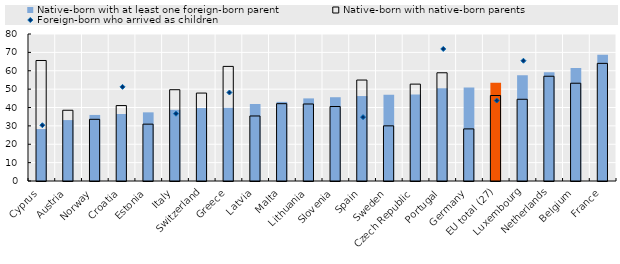
| Category | Native-born with at least one foreign-born parent | Native-born with native-born parents |
|---|---|---|
| Cyprus | 28.262 | 65.582 |
| Austria | 33.153 | 38.5 |
| Norway | 35.952 | 33.57 |
| Croatia | 36.472 | 41.052 |
| Estonia | 37.365 | 30.942 |
| Italy | 38.757 | 49.677 |
| Switzerland | 39.709 | 47.851 |
| Greece | 39.848 | 62.364 |
| Latvia | 41.891 | 35.385 |
| Malta | 43.061 | 42.083 |
| Lithuania | 44.958 | 41.912 |
| Slovenia | 45.594 | 40.538 |
| Spain | 46.229 | 54.945 |
| Sweden | 46.888 | 30.016 |
| Czech Republic | 47.069 | 52.727 |
| Portugal | 50.419 | 58.899 |
| Germany | 50.879 | 28.353 |
| EU total (27) | 53.526 | 46.52 |
| Luxembourg | 57.56 | 44.475 |
| Netherlands | 59.19 | 57.014 |
| Belgium | 61.541 | 53.212 |
| France | 68.667 | 64.019 |